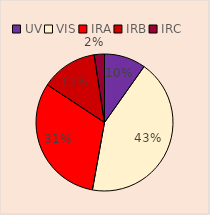
| Category | Series 0 |
|---|---|
| UV | 0.098 |
| VIS | 0.43 |
| IRA | 0.315 |
| IRB | 0.133 |
| IRC | 0.024 |